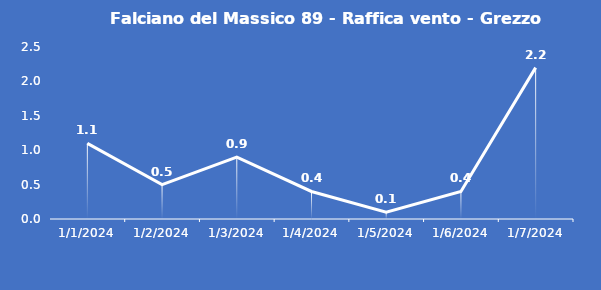
| Category | Falciano del Massico 89 - Raffica vento - Grezzo (m/s) |
|---|---|
| 1/1/24 | 1.1 |
| 1/2/24 | 0.5 |
| 1/3/24 | 0.9 |
| 1/4/24 | 0.4 |
| 1/5/24 | 0.1 |
| 1/6/24 | 0.4 |
| 1/7/24 | 2.2 |